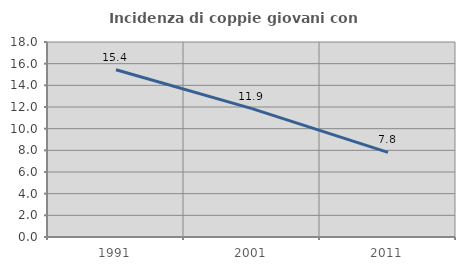
| Category | Incidenza di coppie giovani con figli |
|---|---|
| 1991.0 | 15.439 |
| 2001.0 | 11.852 |
| 2011.0 | 7.812 |